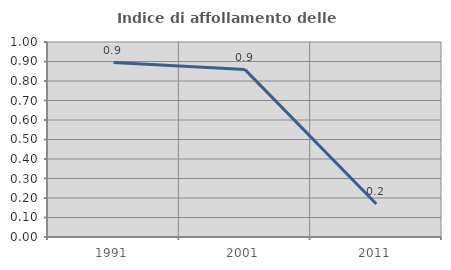
| Category | Indice di affollamento delle abitazioni  |
|---|---|
| 1991.0 | 0.895 |
| 2001.0 | 0.858 |
| 2011.0 | 0.169 |